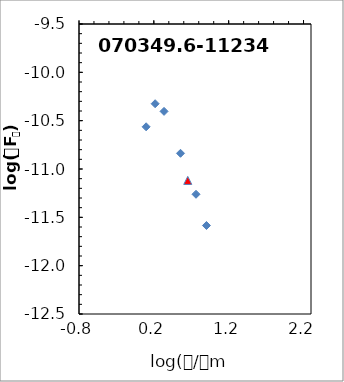
| Category | Series 0 |
|---|---|
| 0.0969100130080564 | -10.564 |
| 0.217483944213906 | -10.325 |
| 0.336459733848529 | -10.404 |
| 0.556302500767287 | -10.837 |
| 0.653212513775344 | -11.118 |
| 0.763427993562937 | -11.261 |
| 0.903089986991944 | -11.585 |
| 1.380211241711606 | 0 |